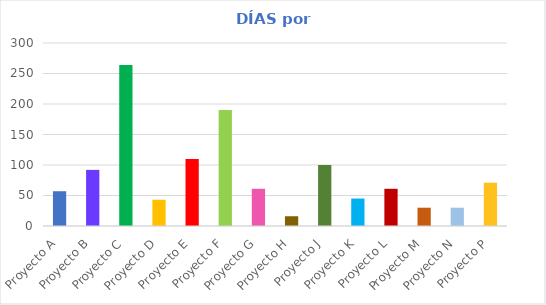
| Category | # DÍAS |
|---|---|
| Proyecto A | 57 |
| Proyecto B | 92 |
| Proyecto C | 264 |
| Proyecto D | 43 |
| Proyecto E | 110 |
| Proyecto F | 190 |
| Proyecto G | 61 |
| Proyecto H | 16 |
| Proyecto J | 100 |
| Proyecto K | 45 |
| Proyecto L | 61 |
| Proyecto M | 30 |
| Proyecto N | 30 |
| Proyecto P | 71 |